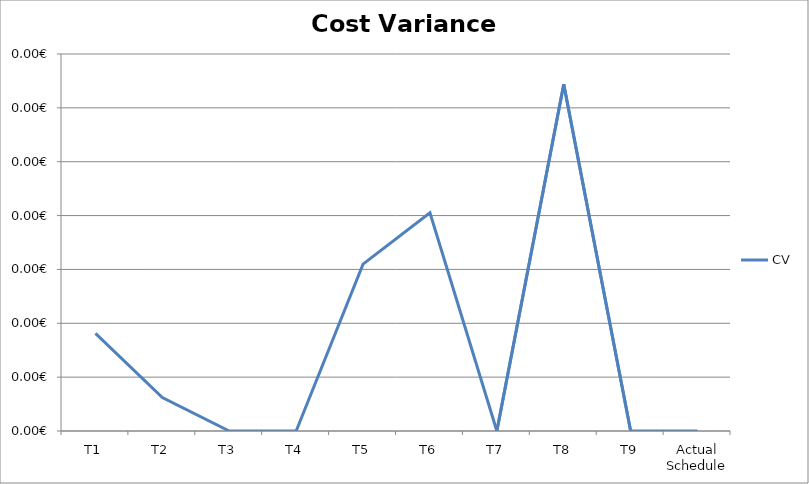
| Category | CV |
|---|---|
| T1 | 0 |
| T2 | 0 |
| T3 | 0 |
| T4 | 0 |
| T5 | 0 |
| T6 | 0 |
| T7 | 0 |
| T8 | 0.001 |
| T9 | 0 |
| Actual Schedule | 0 |